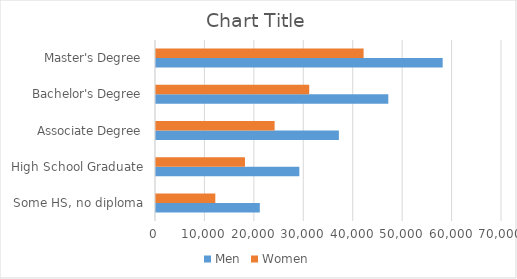
| Category | Men | Women |
|---|---|---|
| Some HS, no diploma | 21000 | 12000 |
| High School Graduate | 29000 | 18000 |
| Associate Degree | 37000 | 24000 |
| Bachelor's Degree | 47000 | 31000 |
| Master's Degree | 58000 | 42000 |